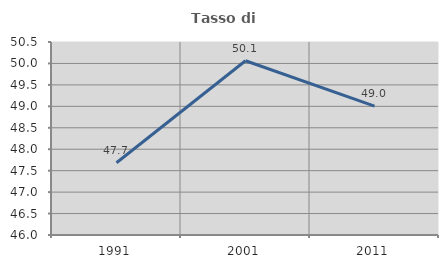
| Category | Tasso di occupazione   |
|---|---|
| 1991.0 | 47.684 |
| 2001.0 | 50.063 |
| 2011.0 | 49.006 |